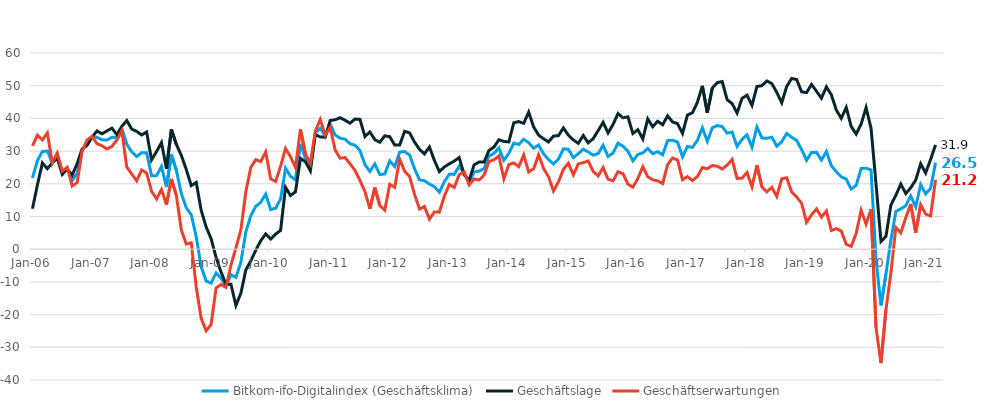
| Category | Bitkom-ifo-Digitalindex (Geschäftsklima) | Geschäftslage | Geschäftserwartungen |
|---|---|---|---|
| 2006-01-01 | 21.79 | 12.39 | 31.61 |
| 2006-02-01 | 27.15 | 19.7 | 34.86 |
| 2006-03-01 | 29.87 | 26.39 | 33.41 |
| 2006-04-01 | 30.02 | 24.62 | 35.56 |
| 2006-05-01 | 26.36 | 26.39 | 26.33 |
| 2006-06-01 | 28.65 | 27.91 | 29.38 |
| 2006-07-01 | 23.36 | 22.87 | 23.85 |
| 2006-08-01 | 24.78 | 24.51 | 25.04 |
| 2006-09-01 | 20.98 | 22.66 | 19.33 |
| 2006-10-01 | 23.24 | 26.16 | 20.37 |
| 2006-11-01 | 30.3 | 30.63 | 29.96 |
| 2006-12-01 | 32.57 | 31.74 | 33.4 |
| 2007-01-01 | 34.39 | 34.26 | 34.53 |
| 2007-02-01 | 34.19 | 36.16 | 32.24 |
| 2007-03-01 | 33.46 | 35.29 | 31.64 |
| 2007-04-01 | 33.38 | 36.16 | 30.64 |
| 2007-05-01 | 34.21 | 37.03 | 31.42 |
| 2007-06-01 | 34.17 | 35.01 | 33.32 |
| 2007-07-01 | 36.9 | 37.57 | 36.22 |
| 2007-08-01 | 32.14 | 39.35 | 25.14 |
| 2007-09-01 | 29.77 | 36.73 | 23.02 |
| 2007-10-01 | 28.34 | 36.04 | 20.9 |
| 2007-11-01 | 29.52 | 34.93 | 24.24 |
| 2007-12-01 | 29.48 | 35.84 | 23.3 |
| 2008-01-01 | 22.48 | 27.32 | 17.74 |
| 2008-02-01 | 22.49 | 29.86 | 15.36 |
| 2008-03-01 | 25.31 | 32.61 | 18.24 |
| 2008-04-01 | 19.02 | 24.58 | 13.6 |
| 2008-05-01 | 28.93 | 36.62 | 21.48 |
| 2008-06-01 | 24.08 | 32.02 | 16.41 |
| 2008-07-01 | 16.98 | 28.69 | 5.86 |
| 2008-08-01 | 12.65 | 24.35 | 1.55 |
| 2008-09-01 | 10.52 | 19.44 | 1.96 |
| 2008-10-01 | 3.77 | 20.42 | -11.62 |
| 2008-11-01 | -5.34 | 11.89 | -21.16 |
| 2008-12-01 | -9.73 | 6.8 | -24.95 |
| 2009-01-01 | -10.36 | 3.2 | -23.02 |
| 2009-02-01 | -7.25 | -2.52 | -11.87 |
| 2009-03-01 | -8.91 | -6.99 | -10.81 |
| 2009-04-01 | -11.23 | -10.78 | -11.69 |
| 2009-05-01 | -7.81 | -10.74 | -4.83 |
| 2009-06-01 | -8.6 | -17.2 | 0.4 |
| 2009-07-01 | -4 | -13.46 | 5.94 |
| 2009-08-01 | 5.28 | -6.31 | 17.57 |
| 2009-09-01 | 10.23 | -3.57 | 25 |
| 2009-10-01 | 13.11 | -0.3 | 27.41 |
| 2009-11-01 | 14.34 | 2.58 | 26.78 |
| 2009-12-01 | 16.84 | 4.66 | 29.74 |
| 2010-01-01 | 12.13 | 3.12 | 21.54 |
| 2010-02-01 | 12.51 | 4.62 | 20.7 |
| 2010-03-01 | 15.34 | 5.75 | 25.38 |
| 2010-04-01 | 24.78 | 18.93 | 30.79 |
| 2010-05-01 | 22.27 | 16.41 | 28.28 |
| 2010-06-01 | 21.24 | 17.55 | 25 |
| 2010-07-01 | 32.18 | 27.78 | 36.66 |
| 2010-08-01 | 28.01 | 26.77 | 29.24 |
| 2010-09-01 | 25.09 | 23.97 | 26.21 |
| 2010-10-01 | 35.57 | 35.06 | 36.07 |
| 2010-11-01 | 36.97 | 34.31 | 39.67 |
| 2010-12-01 | 34.58 | 34.25 | 34.91 |
| 2011-01-01 | 38.27 | 39.35 | 37.2 |
| 2011-02-01 | 34.91 | 39.58 | 30.33 |
| 2011-03-01 | 33.95 | 40.22 | 27.84 |
| 2011-04-01 | 33.65 | 39.42 | 28.02 |
| 2011-05-01 | 32.24 | 38.54 | 26.1 |
| 2011-06-01 | 31.82 | 39.8 | 24.11 |
| 2011-07-01 | 30.18 | 39.7 | 21.04 |
| 2011-08-01 | 25.87 | 34.45 | 17.59 |
| 2011-09-01 | 23.78 | 35.86 | 12.33 |
| 2011-10-01 | 26.04 | 33.49 | 18.83 |
| 2011-11-01 | 22.83 | 32.73 | 13.35 |
| 2011-12-01 | 23.02 | 34.67 | 11.94 |
| 2012-01-01 | 27.01 | 34.42 | 19.83 |
| 2012-02-01 | 25.28 | 31.83 | 18.91 |
| 2012-03-01 | 29.69 | 31.85 | 27.55 |
| 2012-04-01 | 29.87 | 36.06 | 23.85 |
| 2012-05-01 | 28.79 | 35.56 | 22.22 |
| 2012-06-01 | 24.6 | 32.75 | 16.74 |
| 2012-07-01 | 21.21 | 30.54 | 12.26 |
| 2012-08-01 | 20.96 | 29.15 | 13.07 |
| 2012-09-01 | 19.92 | 31.25 | 9.15 |
| 2012-10-01 | 19.14 | 27.14 | 11.41 |
| 2012-11-01 | 17.44 | 23.73 | 11.32 |
| 2012-12-01 | 20.64 | 25.15 | 16.22 |
| 2013-01-01 | 22.93 | 26.1 | 19.81 |
| 2013-02-01 | 22.87 | 26.94 | 18.87 |
| 2013-03-01 | 25.4 | 28.04 | 22.79 |
| 2013-04-01 | 23.2 | 22.76 | 23.64 |
| 2013-05-01 | 20.35 | 21.06 | 19.65 |
| 2013-06-01 | 23.62 | 25.79 | 21.47 |
| 2013-07-01 | 23.88 | 26.65 | 21.14 |
| 2013-08-01 | 24.6 | 26.63 | 22.58 |
| 2013-09-01 | 28.5 | 30.21 | 26.81 |
| 2013-10-01 | 29.27 | 31.23 | 27.34 |
| 2013-11-01 | 30.99 | 33.47 | 28.53 |
| 2013-12-01 | 27.17 | 32.95 | 21.53 |
| 2014-01-01 | 29.3 | 32.8 | 25.86 |
| 2014-02-01 | 32.43 | 38.65 | 26.37 |
| 2014-03-01 | 32.03 | 39.03 | 25.23 |
| 2014-04-01 | 33.6 | 38.49 | 28.82 |
| 2014-05-01 | 32.59 | 41.93 | 23.61 |
| 2014-06-01 | 30.89 | 37.39 | 24.57 |
| 2014-07-01 | 31.86 | 34.88 | 28.87 |
| 2014-08-01 | 29.19 | 33.77 | 24.71 |
| 2014-09-01 | 27.42 | 32.8 | 22.16 |
| 2014-10-01 | 26.05 | 34.6 | 17.81 |
| 2014-11-01 | 27.55 | 34.73 | 20.59 |
| 2014-12-01 | 30.68 | 37.09 | 24.45 |
| 2015-01-01 | 30.55 | 34.89 | 26.29 |
| 2015-02-01 | 28.01 | 33.41 | 22.74 |
| 2015-03-01 | 29.2 | 32.38 | 26.06 |
| 2015-04-01 | 30.59 | 34.77 | 26.48 |
| 2015-05-01 | 29.74 | 32.53 | 26.99 |
| 2015-06-01 | 28.75 | 33.8 | 23.8 |
| 2015-07-01 | 29.23 | 36.26 | 22.42 |
| 2015-08-01 | 31.78 | 38.8 | 24.97 |
| 2015-09-01 | 28.37 | 35.56 | 21.4 |
| 2015-10-01 | 29.37 | 38.14 | 20.93 |
| 2015-11-01 | 32.41 | 41.48 | 23.67 |
| 2015-12-01 | 31.49 | 40.18 | 23.13 |
| 2016-01-01 | 29.96 | 40.48 | 19.89 |
| 2016-02-01 | 27.03 | 35.39 | 18.98 |
| 2016-03-01 | 28.96 | 36.55 | 21.62 |
| 2016-04-01 | 29.43 | 33.72 | 25.22 |
| 2016-05-01 | 30.83 | 39.85 | 22.14 |
| 2016-06-01 | 29.2 | 37.45 | 21.23 |
| 2016-07-01 | 29.83 | 39.12 | 20.89 |
| 2016-08-01 | 28.88 | 38.06 | 20.05 |
| 2016-09-01 | 33.21 | 40.78 | 25.87 |
| 2016-10-01 | 33.33 | 38.9 | 27.88 |
| 2016-11-01 | 32.78 | 38.39 | 27.29 |
| 2016-12-01 | 28.22 | 35.4 | 21.26 |
| 2017-01-01 | 31.42 | 41.03 | 22.2 |
| 2017-02-01 | 31.12 | 41.72 | 20.99 |
| 2017-03-01 | 33.28 | 44.9 | 22.21 |
| 2017-04-01 | 37.13 | 49.96 | 24.96 |
| 2017-05-01 | 33 | 41.73 | 24.59 |
| 2017-06-01 | 37.11 | 49.24 | 25.57 |
| 2017-07-01 | 37.81 | 50.93 | 25.39 |
| 2017-08-01 | 37.52 | 51.27 | 24.52 |
| 2017-09-01 | 35.49 | 45.72 | 25.69 |
| 2017-10-01 | 35.83 | 44.52 | 27.46 |
| 2017-11-01 | 31.43 | 41.65 | 21.65 |
| 2017-12-01 | 33.6 | 46.12 | 21.71 |
| 2018-01-01 | 34.98 | 47.11 | 23.45 |
| 2018-02-01 | 31.18 | 43.98 | 19.06 |
| 2018-03-01 | 37.39 | 49.74 | 25.65 |
| 2018-04-01 | 34.05 | 50.02 | 19.09 |
| 2018-05-01 | 33.89 | 51.44 | 17.57 |
| 2018-06-01 | 34.24 | 50.66 | 18.9 |
| 2018-07-01 | 31.51 | 47.97 | 16.14 |
| 2018-08-01 | 32.86 | 44.77 | 21.54 |
| 2018-09-01 | 35.4 | 49.76 | 21.86 |
| 2018-10-01 | 34.22 | 52.21 | 17.52 |
| 2018-11-01 | 33.27 | 51.91 | 16.01 |
| 2018-12-01 | 30.47 | 48.14 | 14.05 |
| 2019-01-01 | 27.2 | 47.88 | 8.24 |
| 2019-02-01 | 29.58 | 50.39 | 10.51 |
| 2019-03-01 | 29.62 | 48.32 | 12.33 |
| 2019-04-01 | 27.26 | 46.18 | 9.8 |
| 2019-05-01 | 29.88 | 49.63 | 11.69 |
| 2019-06-01 | 25.52 | 47.23 | 5.73 |
| 2019-07-01 | 23.69 | 42.55 | 6.3 |
| 2019-08-01 | 22.12 | 40.03 | 5.54 |
| 2019-09-01 | 21.44 | 43.35 | 1.49 |
| 2019-10-01 | 18.42 | 37.52 | 0.85 |
| 2019-11-01 | 19.49 | 35.22 | 4.8 |
| 2019-12-01 | 24.69 | 38.24 | 11.91 |
| 2020-01-01 | 24.77 | 43.31 | 7.64 |
| 2020-02-01 | 24.24 | 36.97 | 12.2 |
| 2020-03-01 | -3.21 | 20.02 | -23.99 |
| 2020-04-01 | -17.18 | 2.37 | -34.85 |
| 2020-05-01 | -7.65 | 3.91 | -18.56 |
| 2020-06-01 | 2.88 | 13.49 | -7.2 |
| 2020-07-01 | 11.53 | 16.5 | 6.67 |
| 2020-08-01 | 12.34 | 19.92 | 5.03 |
| 2020-09-01 | 13.28 | 17 | 9.62 |
| 2020-10-01 | 16.3 | 18.8 | 13.84 |
| 2020-11-01 | 12.92 | 21.14 | 5.01 |
| 2020-12-01 | 19.79 | 26.13 | 13.63 |
| 2021-01-01 | 16.93 | 23.31 | 10.73 |
| 2021-02-01 | 18.65 | 27.44 | 10.2 |
| 2021-03-01 | 26.48 | 31.9 | 21.2 |